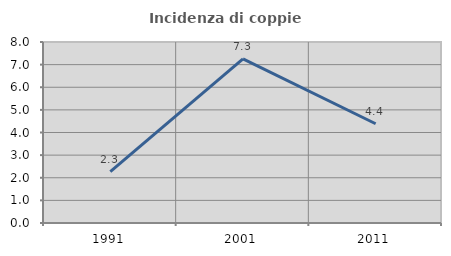
| Category | Incidenza di coppie miste |
|---|---|
| 1991.0 | 2.273 |
| 2001.0 | 7.258 |
| 2011.0 | 4.386 |